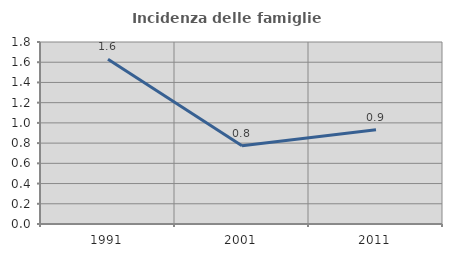
| Category | Incidenza delle famiglie numerose |
|---|---|
| 1991.0 | 1.63 |
| 2001.0 | 0.774 |
| 2011.0 | 0.932 |